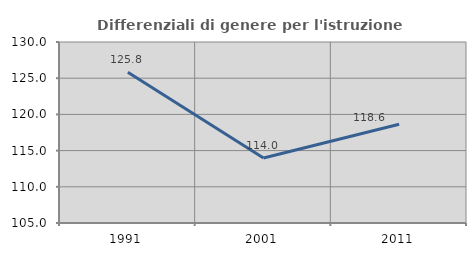
| Category | Differenziali di genere per l'istruzione superiore |
|---|---|
| 1991.0 | 125.816 |
| 2001.0 | 113.968 |
| 2011.0 | 118.629 |